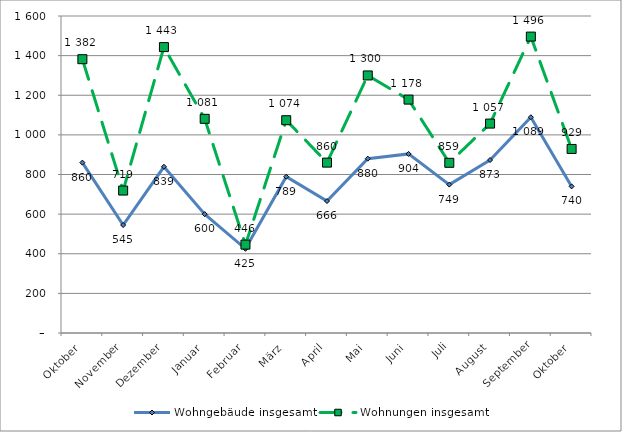
| Category | Wohngebäude insgesamt | Wohnungen insgesamt |
|---|---|---|
| Oktober | 860 | 1382 |
| November | 545 | 719 |
| Dezember | 839 | 1443 |
| Januar | 600 | 1081 |
| Februar | 425 | 446 |
| März | 789 | 1074 |
| April | 666 | 860 |
| Mai | 880 | 1300 |
| Juni | 904 | 1178 |
| Juli | 749 | 859 |
| August | 873 | 1057 |
| September | 1089 | 1496 |
| Oktober | 740 | 929 |